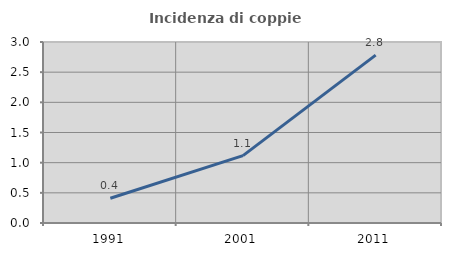
| Category | Incidenza di coppie miste |
|---|---|
| 1991.0 | 0.41 |
| 2001.0 | 1.117 |
| 2011.0 | 2.783 |